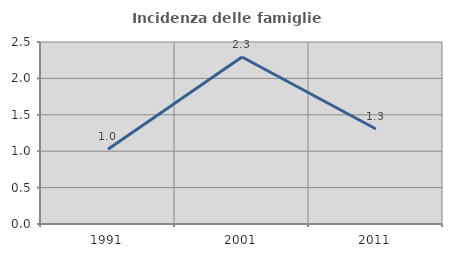
| Category | Incidenza delle famiglie numerose |
|---|---|
| 1991.0 | 1.026 |
| 2001.0 | 2.294 |
| 2011.0 | 1.304 |